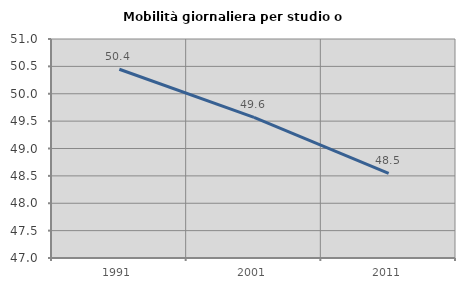
| Category | Mobilità giornaliera per studio o lavoro |
|---|---|
| 1991.0 | 50.448 |
| 2001.0 | 49.568 |
| 2011.0 | 48.547 |